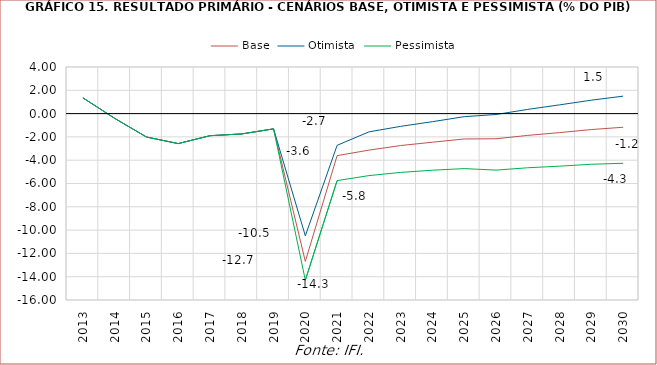
| Category | Base | Otimista | Pessimista |
|---|---|---|---|
| 2013.0 | 1.353 | 1.353 | 1.353 |
| 2014.0 | -0.406 | -0.406 | -0.406 |
| 2015.0 | -2.01 | -2.01 | -2.01 |
| 2016.0 | -2.573 | -2.573 | -2.573 |
| 2017.0 | -1.896 | -1.896 | -1.896 |
| 2018.0 | -1.745 | -1.745 | -1.745 |
| 2019.0 | -1.309 | -1.309 | -1.309 |
| 2020.0 | -12.689 | -10.493 | -14.299 |
| 2021.0 | -3.609 | -2.724 | -5.752 |
| 2022.0 | -3.136 | -1.569 | -5.323 |
| 2023.0 | -2.742 | -1.095 | -5.048 |
| 2024.0 | -2.456 | -0.694 | -4.86 |
| 2025.0 | -2.178 | -0.263 | -4.722 |
| 2026.0 | -2.161 | -0.077 | -4.85 |
| 2027.0 | -1.87 | 0.362 | -4.649 |
| 2028.0 | -1.631 | 0.749 | -4.51 |
| 2029.0 | -1.37 | 1.152 | -4.35 |
| 2030.0 | -1.172 | 1.498 | -4.263 |